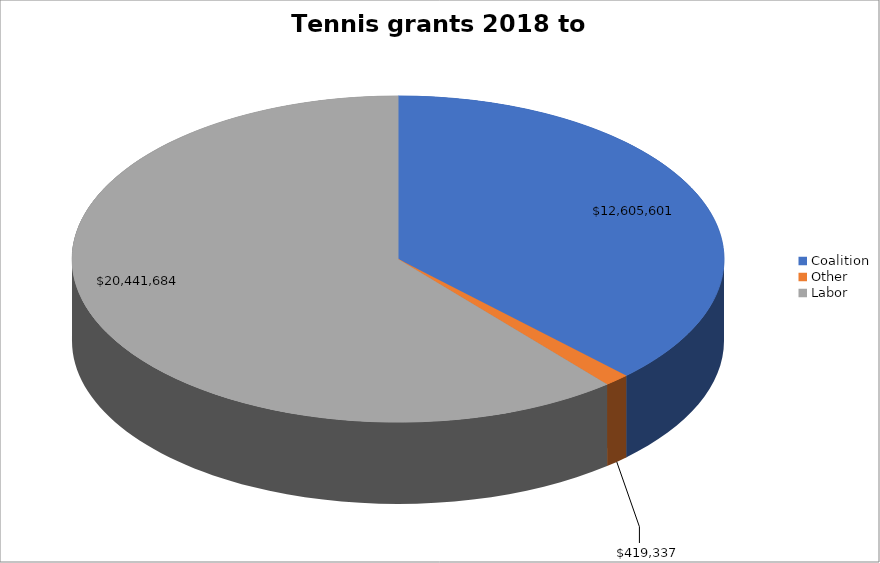
| Category | Tennis grants 2018 to 2022 |
|---|---|
| Coalition | 12605600.88 |
| Other | 419337 |
| Labor | 20441684.35 |